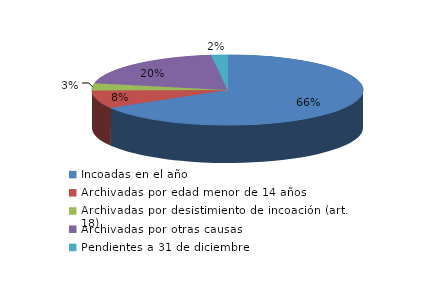
| Category | Series 0 |
|---|---|
| Incoadas en el año | 754 |
| Archivadas por edad menor de 14 años | 94 |
| Archivadas por desistimiento de incoación (art. 18) | 38 |
| Archivadas por otras causas | 226 |
| Pendientes a 31 de diciembre | 22 |